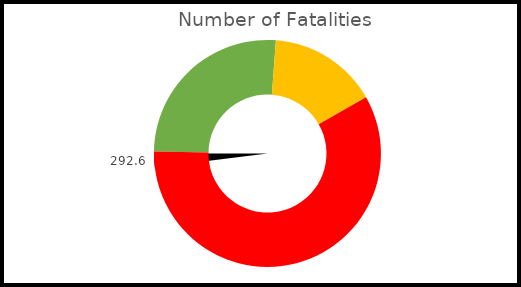
| Category | Pointer |
|---|---|
| 0 | 292.6 |
| 1 | 5.852 |
| 2 | 605.548 |